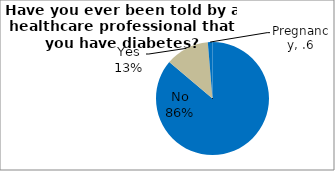
| Category | Series 0 |
|---|---|
| No | 86.136 |
| Yes | 12.54 |
| Pregnancy | 1.325 |